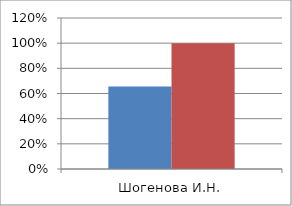
| Category | Series 0 | 2 |
|---|---|---|
| Шогенова И.Н. | 0.655 | 1 |